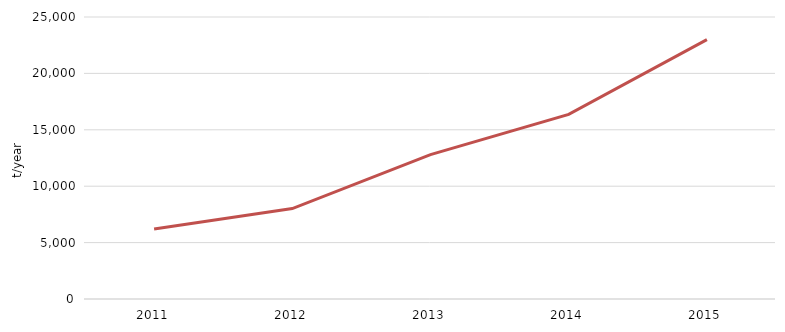
| Category | Collected quantity |
|---|---|
| 2011.0 | 6198.87 |
| 2012.0 | 8018.25 |
| 2013.0 | 12799.62 |
| 2014.0 | 16366.2 |
| 2015.0 | 22992.25 |